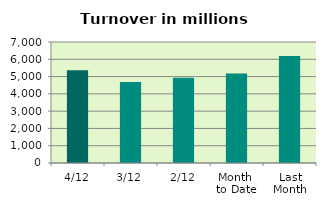
| Category | Series 0 |
|---|---|
| 4/12 | 5360.076 |
| 3/12 | 4681.107 |
| 2/12 | 4931.606 |
| Month 
to Date | 5172.986 |
| Last
Month | 6195.501 |